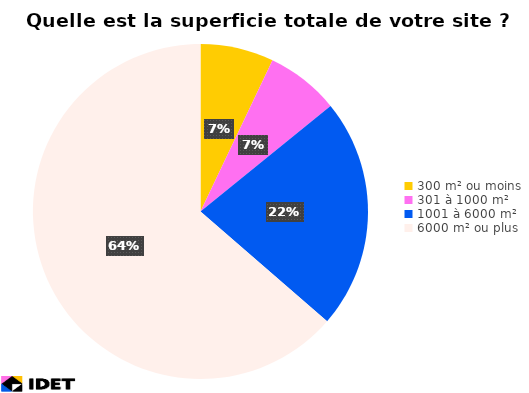
| Category | Series 1 | Series 0 |
|---|---|---|
| 300 m² ou moins | 7 | 7 |
| 301 à 1000 m² | 7 | 7 |
| 1001 à 6000 m² | 22 | 22 |
| 6000 m² ou plus | 63 | 63 |